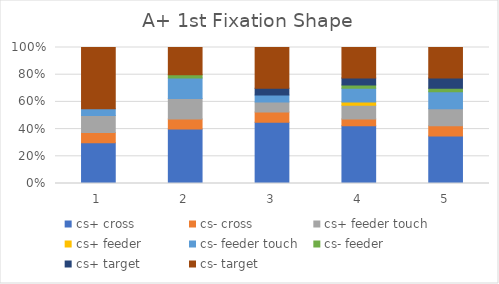
| Category | cs+ cross | cs- cross | cs+ feeder touch | cs+ feeder | cs- feeder touch | cs- feeder | cs+ target | cs- target |
|---|---|---|---|---|---|---|---|---|
| 0 | 12 | 3 | 5 | 0 | 2 | 0 | 0 | 18 |
| 1 | 16 | 3 | 6 | 0 | 6 | 1 | 0 | 8 |
| 2 | 18 | 3 | 3 | 0 | 2 | 0 | 2 | 12 |
| 3 | 17 | 2 | 4 | 1 | 4 | 1 | 2 | 9 |
| 4 | 14 | 3 | 5 | 0 | 5 | 1 | 3 | 9 |